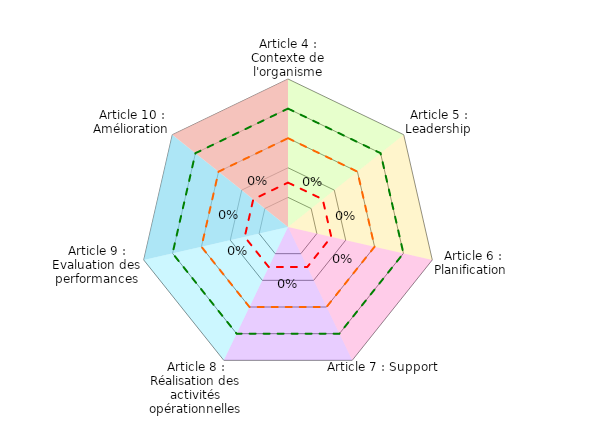
| Category | Coloriage Art4 | Coloriage Art5 | Coloriage Art6 | Coloriage Art7 | Coloriage Art8 | Coloriage Art9 | Coloriage Art10 | Conforme | Convaincant | Informel | Résultat |
|---|---|---|---|---|---|---|---|---|---|---|---|
| Article 4 : Contexte de l'organisme | 1 | 0 | 0 | 0 | 0 | 0 | 1 | 0.8 | 0.6 | 0.3 | 0 |
| Article 5 : Leadership | 1 | 1 | 0 | 0 | 0 | 0 | 0 | 0.8 | 0.6 | 0.3 | 0 |
| Article 6 : Planification  | 0 | 1 | 1 | 0 | 0 | 0 | 0 | 0.8 | 0.6 | 0.3 | 0 |
| Article 7 : Support | 0 | 0 | 1 | 1 | 0 | 0 | 0 | 0.8 | 0.6 | 0.3 | 0 |
| Article 8 : Réalisation des activités opérationnelles | 0 | 0 | 0 | 1 | 1 | 0 | 1 | 0.8 | 0.6 | 0.3 | 0 |
| Article 9 : Evaluation des performances | 0 | 0 | 0 | 0 | 1 | 1 | 0 | 0.8 | 0.6 | 0.3 | 0 |
| Article 10 : Amélioration | 0 | 0 | 0 | 0 | 0 | 1 | 1 | 0.8 | 0.6 | 0.3 | 0 |